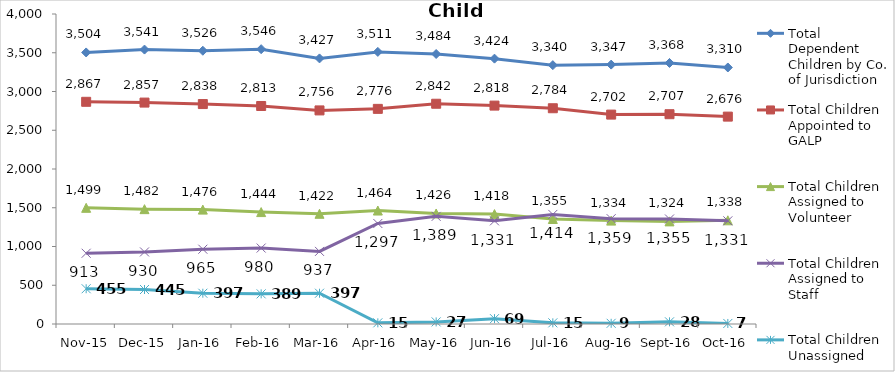
| Category | Total Dependent Children by Co. of Jurisdiction | Total Children Appointed to GALP | Total Children Assigned to Volunteer | Total Children Assigned to Staff | Total Children Unassigned |
|---|---|---|---|---|---|
| Nov-15 | 3504 | 2867 | 1499 | 913 | 455 |
| Dec-15 | 3541 | 2857 | 1482 | 930 | 445 |
| Jan-16 | 3526 | 2838 | 1476 | 965 | 397 |
| Feb-16 | 3546 | 2813 | 1444 | 980 | 389 |
| Mar-16 | 3427 | 2756 | 1422 | 937 | 397 |
| Apr-16 | 3511 | 2776 | 1464 | 1297 | 15 |
| May-16 | 3484 | 2842 | 1426 | 1389 | 27 |
| Jun-16 | 3424 | 2818 | 1418 | 1331 | 69 |
| Jul-16 | 3340 | 2784 | 1355 | 1414 | 15 |
| Aug-16 | 3347 | 2702 | 1334 | 1359 | 9 |
| Sep-16 | 3368 | 2707 | 1324 | 1355 | 28 |
| Oct-16 | 3310 | 2676 | 1338 | 1331 | 7 |